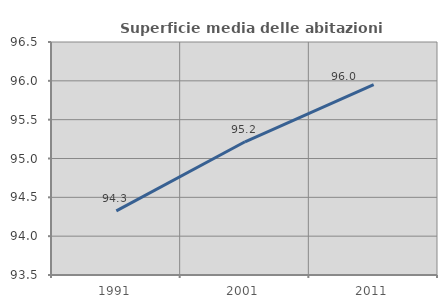
| Category | Superficie media delle abitazioni occupate |
|---|---|
| 1991.0 | 94.326 |
| 2001.0 | 95.215 |
| 2011.0 | 95.951 |